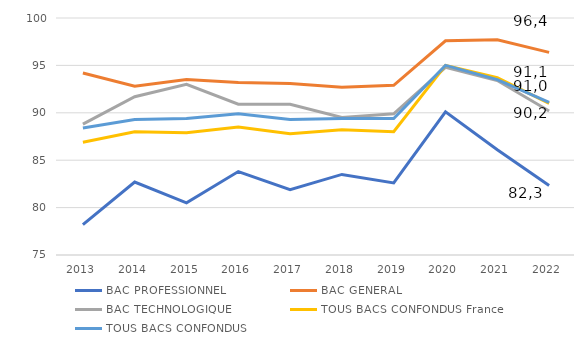
| Category | BAC PROFESSIONNEL | BAC GENERAL | BAC TECHNOLOGIQUE | TOUS BACS CONFONDUS France | TOUS BACS CONFONDUS |
|---|---|---|---|---|---|
| 2013 | 78.2 | 94.2 | 88.8 | 86.9 | 88.4 |
| 2014 | 82.7 | 92.8 | 91.7 | 88 | 89.3 |
| 2015 | 80.5 | 93.5 | 93 | 87.9 | 89.4 |
| 2016 | 83.8 | 93.2 | 90.9 | 88.5 | 89.9 |
| 2017 | 81.9 | 93.1 | 90.9 | 87.8 | 89.3 |
| 2018 | 83.5 | 92.7 | 89.5 | 88.2 | 89.4 |
| 2019 | 82.6 | 92.9 | 89.9 | 88 | 89.4 |
| 2020 | 90.1 | 97.6 | 94.8 | 95 | 95 |
| 2021 | 86.1 | 97.7 | 93.4 | 93.7 | 93.5 |
| 2022 | 82.334 | 96.377 | 90.198 | 91 | 91.1 |